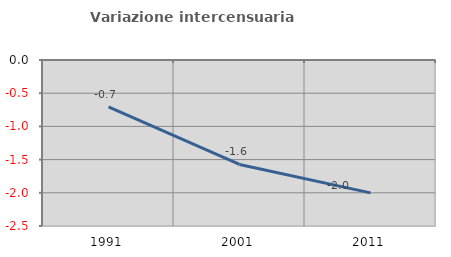
| Category | Variazione intercensuaria annua |
|---|---|
| 1991.0 | -0.707 |
| 2001.0 | -1.573 |
| 2011.0 | -2.001 |